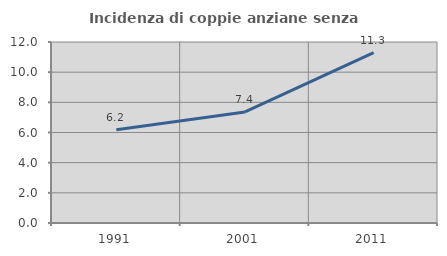
| Category | Incidenza di coppie anziane senza figli  |
|---|---|
| 1991.0 | 6.187 |
| 2001.0 | 7.363 |
| 2011.0 | 11.292 |